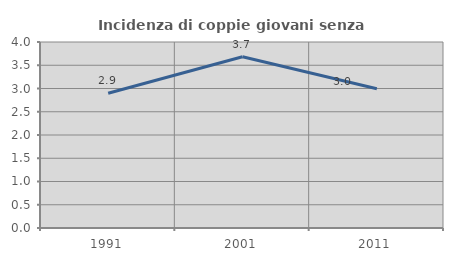
| Category | Incidenza di coppie giovani senza figli |
|---|---|
| 1991.0 | 2.899 |
| 2001.0 | 3.684 |
| 2011.0 | 2.996 |